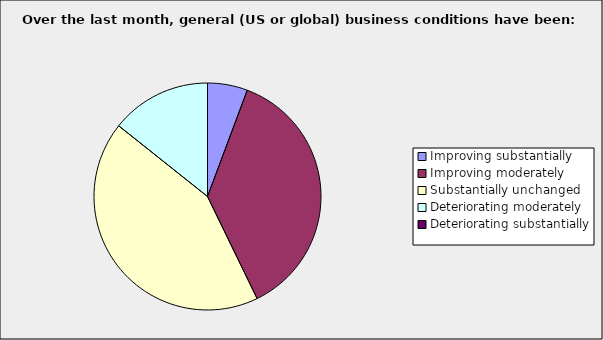
| Category | Series 0 |
|---|---|
| Improving substantially | 0.057 |
| Improving moderately | 0.371 |
| Substantially unchanged | 0.429 |
| Deteriorating moderately | 0.143 |
| Deteriorating substantially | 0 |